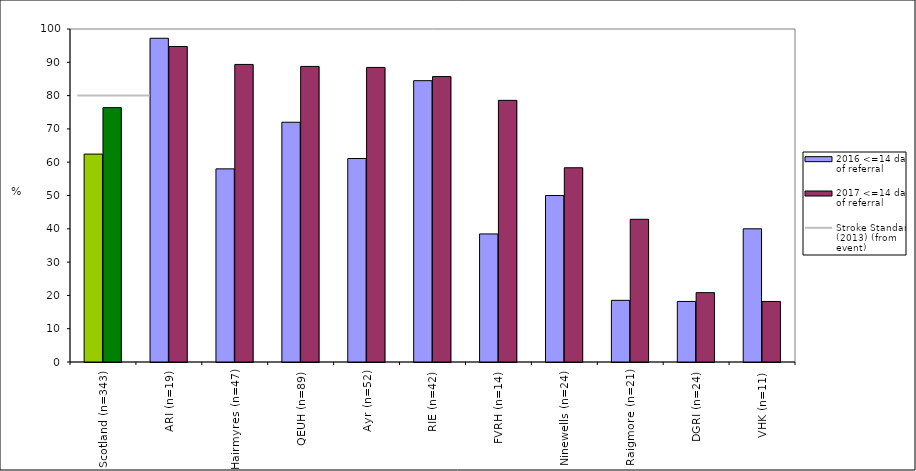
| Category | 2016 <=14 days of referral | 2017 <=14 days of referral |
|---|---|---|
| Scotland (n=343) | 62.435 | 76.385 |
| ARI (n=19) | 97.222 | 94.737 |
| Hairmyres (n=47) | 58 | 89.362 |
| QEUH (n=89) | 72 | 88.764 |
| Ayr (n=52) | 61.111 | 88.462 |
| RIE (n=42) | 84.483 | 85.714 |
| FVRH (n=14) | 38.462 | 78.571 |
| Ninewells (n=24) | 50 | 58.333 |
| Raigmore (n=21) | 18.519 | 42.857 |
| DGRI (n=24) | 18.182 | 20.833 |
| VHK (n=11) | 40 | 18.182 |